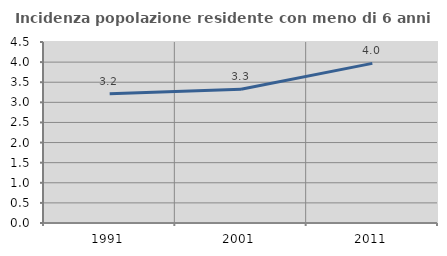
| Category | Incidenza popolazione residente con meno di 6 anni |
|---|---|
| 1991.0 | 3.216 |
| 2001.0 | 3.326 |
| 2011.0 | 3.968 |